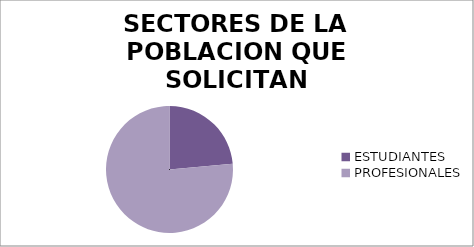
| Category | SECTORES DE LA POBLACION QUE SOLICITAN INFORMACION  |
|---|---|
| ESTUDIANTES  | 4 |
| PROFESIONALES | 13 |